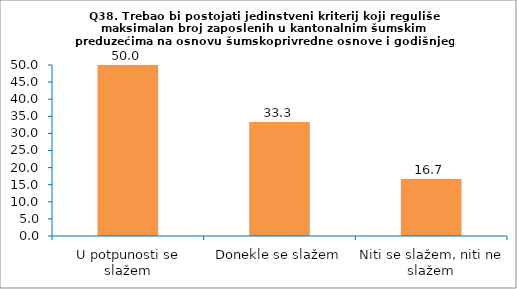
| Category | Series 0 |
|---|---|
| U potpunosti se slažem | 50 |
| Donekle se slažem | 33.333 |
| Niti se slažem, niti ne slažem | 16.667 |